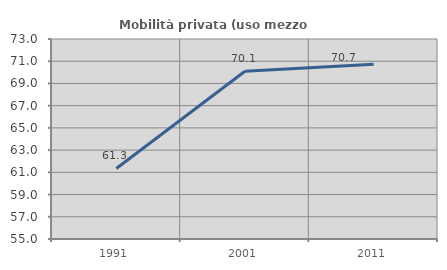
| Category | Mobilità privata (uso mezzo privato) |
|---|---|
| 1991.0 | 61.346 |
| 2001.0 | 70.094 |
| 2011.0 | 70.728 |